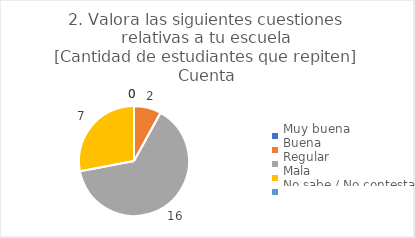
| Category | 2. Valora las siguientes cuestiones relativas a tu escuela
[Cantidad de estudiantes que repiten] |
|---|---|
| Muy buena  | 0 |
| Buena  | 0.08 |
| Regular  | 0.64 |
| Mala  | 0.28 |
| No sabe / No contesta | 0 |